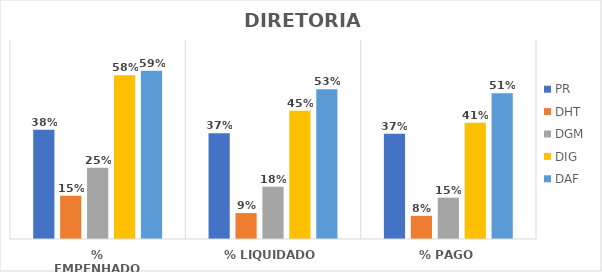
| Category | PR | DHT | DGM | DIG | DAF |
|---|---|---|---|---|---|
| % EMPENHADO | 0.384 | 0.153 | 0.251 | 0.576 | 0.591 |
| % LIQUIDADO | 0.372 | 0.091 | 0.184 | 0.451 | 0.527 |
| % PAGO | 0.37 | 0.081 | 0.145 | 0.409 | 0.513 |